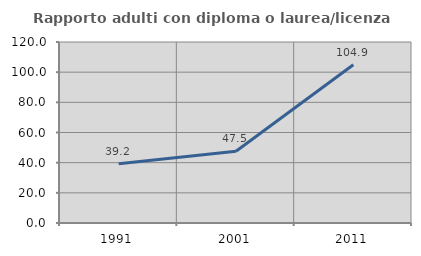
| Category | Rapporto adulti con diploma o laurea/licenza media  |
|---|---|
| 1991.0 | 39.225 |
| 2001.0 | 47.519 |
| 2011.0 | 104.911 |